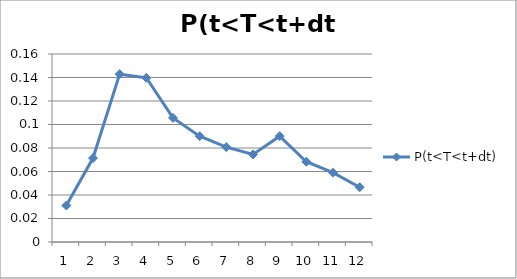
| Category | P(t<T<t+dt) |
|---|---|
| 0 | 0.031 |
| 1 | 0.071 |
| 2 | 0.143 |
| 3 | 0.14 |
| 4 | 0.106 |
| 5 | 0.09 |
| 6 | 0.081 |
| 7 | 0.075 |
| 8 | 0.09 |
| 9 | 0.068 |
| 10 | 0.059 |
| 11 | 0.047 |